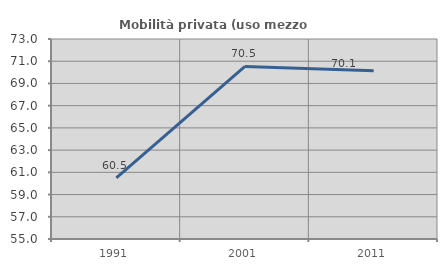
| Category | Mobilità privata (uso mezzo privato) |
|---|---|
| 1991.0 | 60.506 |
| 2001.0 | 70.532 |
| 2011.0 | 70.145 |